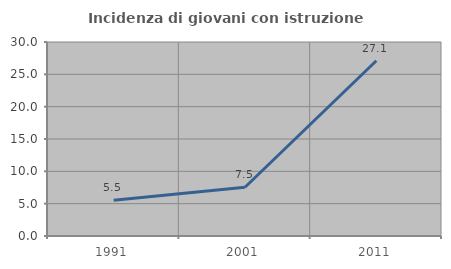
| Category | Incidenza di giovani con istruzione universitaria |
|---|---|
| 1991.0 | 5.521 |
| 2001.0 | 7.534 |
| 2011.0 | 27.103 |